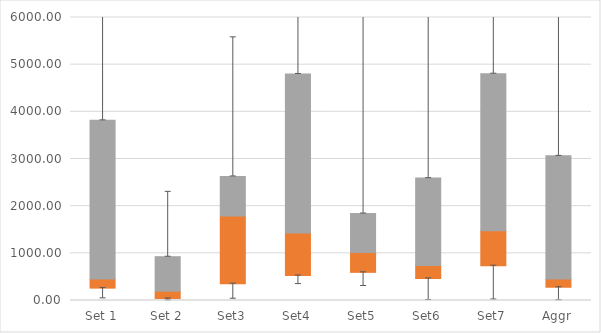
| Category | Q1 | Median-Q1 | Q3-Median |
|---|---|---|---|
| Set 1 | 262.42 | 191.104 | 3366.661 |
| Set 2 | 42.812 | 155.188 | 730.897 |
| Set3 | 356.171 | 1433.594 | 841.4 |
| Set4 | 528.19 | 901.787 | 3373.967 |
| Set5 | 596.78 | 419.338 | 828.908 |
| Set6 | 466.634 | 275.317 | 1852.605 |
| Set7 | 737.313 | 740.962 | 3330.894 |
| Aggr | 280.866 | 172.657 | 2613.06 |